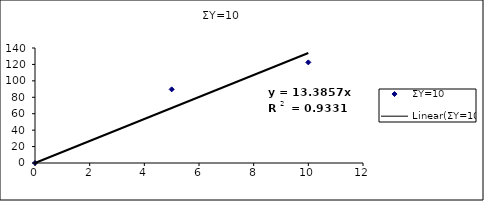
| Category | ΣΥ=10 |
|---|---|
| 0.0 | 0 |
| 5.0 | 89.643 |
| 10.0 | 122.5 |